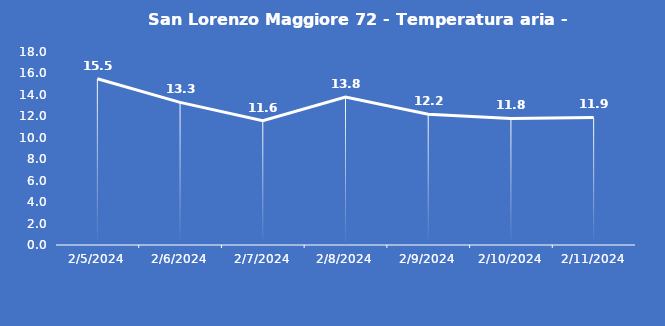
| Category | San Lorenzo Maggiore 72 - Temperatura aria - Grezzo (°C) |
|---|---|
| 2/5/24 | 15.5 |
| 2/6/24 | 13.3 |
| 2/7/24 | 11.6 |
| 2/8/24 | 13.8 |
| 2/9/24 | 12.2 |
| 2/10/24 | 11.8 |
| 2/11/24 | 11.9 |